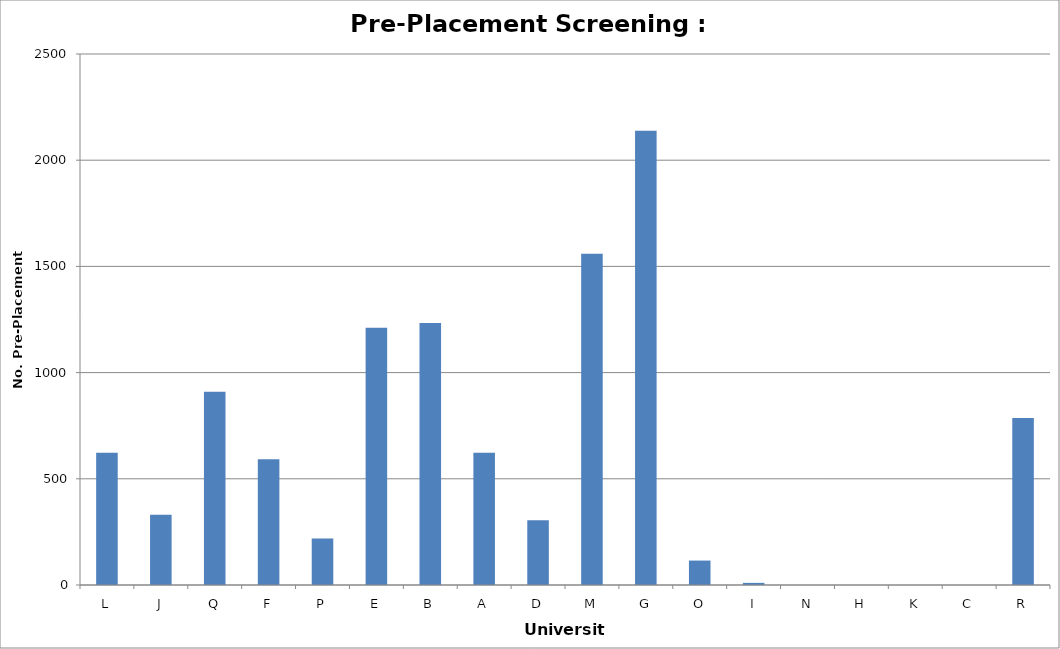
| Category | Total No Pre-Placement Screening |
|---|---|
| L | 623 |
| J | 331 |
| Q | 910 |
| F | 592 |
| P | 219 |
| E | 1211 |
| B | 1234 |
| A | 623 |
| D | 305 |
| M | 1560 |
| G | 2139 |
| O | 115 |
| I | 10 |
| N | 0 |
| H | 0 |
| K | 0 |
| C | 0 |
| R | 786 |